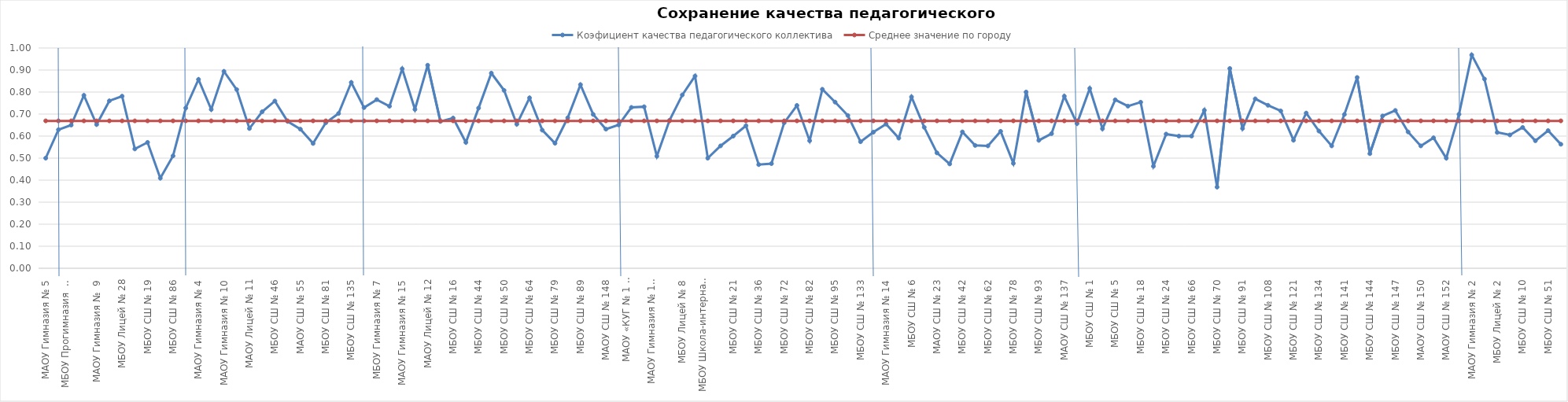
| Category | Коэфициент качества педагогического коллектива | Среднее значение по городу |
|---|---|---|
| МАОУ Гимназия № 5 | 0.5 | 0.669 |
| ЖЕЛЕЗНОДОРОЖНЫЙ РАЙОН | 0.629 | 0.669 |
| МБОУ Прогимназия  № 131 | 0.65 | 0.669 |
| МБОУ Гимназия № 8 | 0.785 | 0.669 |
| МАОУ Гимназия №  9 | 0.653 | 0.669 |
| МАОУ Лицей № 7 | 0.76 | 0.669 |
| МБОУ Лицей № 28 | 0.781 | 0.669 |
| МБОУ СШ  № 12 | 0.542 | 0.669 |
| МБОУ СШ № 19 | 0.571 | 0.669 |
| МАОУ СШ № 32 | 0.409 | 0.669 |
| МБОУ СШ № 86 | 0.51 | 0.669 |
| КИРОВСКИЙ РАЙОН | 0.728 | 0.669 |
| МАОУ Гимназия № 4 | 0.857 | 0.669 |
| МАОУ Гимназия № 6 | 0.721 | 0.669 |
| МАОУ Гимназия № 10 | 0.894 | 0.669 |
| МАОУ Лицей № 6 "Перспектива" | 0.811 | 0.669 |
| МАОУ Лицей № 11 | 0.635 | 0.669 |
| МБОУ СШ № 8 "Созидание" | 0.711 | 0.669 |
| МБОУ СШ № 46 | 0.759 | 0.669 |
| МБОУ СШ № 49 | 0.667 | 0.669 |
| МАОУ СШ № 55 | 0.632 | 0.669 |
| МБОУ СШ № 63 | 0.567 | 0.669 |
| МБОУ СШ № 81 | 0.661 | 0.669 |
| МБОУ СШ № 90 | 0.703 | 0.669 |
| МБОУ СШ № 135 | 0.844 | 0.669 |
| ЛЕНИНСКИЙ РАЙОН | 0.729 | 0.669 |
| МБОУ Гимназия № 7 | 0.766 | 0.669 |
| МАОУ Гимназия № 11 | 0.736 | 0.669 |
| МАОУ Гимназия № 15 | 0.905 | 0.669 |
| МБОУ Лицей № 3 | 0.721 | 0.669 |
| МАОУ Лицей № 12 | 0.922 | 0.669 |
| МБОУ СШ № 13 | 0.667 | 0.669 |
| МБОУ СШ № 16 | 0.682 | 0.669 |
| МБОУ СШ № 31 | 0.571 | 0.669 |
| МБОУ СШ № 44 | 0.727 | 0.669 |
| МБОУ СШ № 47 | 0.886 | 0.669 |
| МБОУ СШ № 50 | 0.808 | 0.669 |
| МБОУ СШ № 53 | 0.654 | 0.669 |
| МБОУ СШ № 64 | 0.774 | 0.669 |
| МБОУ СШ № 65 | 0.627 | 0.669 |
| МБОУ СШ № 79 | 0.568 | 0.669 |
| МБОУ СШ № 88 | 0.683 | 0.669 |
| МБОУ СШ № 89 | 0.833 | 0.669 |
| МБОУ СШ № 94 | 0.698 | 0.669 |
| МАОУ СШ № 148 | 0.632 | 0.669 |
| ОКТЯБРЬСКИЙ РАЙОН | 0.651 | 0.669 |
| МАОУ «КУГ № 1 – Универс» | 0.73 | 0.669 |
| МАОУ Гимназия № 3 | 0.733 | 0.669 |
| МАОУ Гимназия № 13 "Академ" | 0.509 | 0.669 |
| МАОУ Лицей № 1 | 0.672 | 0.669 |
| МБОУ Лицей № 8 | 0.787 | 0.669 |
| МБОУ Лицей № 10 | 0.873 | 0.669 |
| МБОУ Школа-интернат № 1 | 0.5 | 0.669 |
| МБОУ СШ № 3 | 0.556 | 0.669 |
| МБОУ СШ № 21 | 0.6 | 0.669 |
| МБОУ СШ № 30 | 0.647 | 0.669 |
| МБОУ СШ № 36 | 0.471 | 0.669 |
| МБОУ СШ № 39 | 0.475 | 0.669 |
| МБОУ СШ № 72 | 0.66 | 0.669 |
| МБОУ СШ № 73 | 0.739 | 0.669 |
| МБОУ СШ № 82 | 0.579 | 0.669 |
| МБОУ СШ № 84 | 0.812 | 0.669 |
| МБОУ СШ № 95 | 0.754 | 0.669 |
| МБОУ СШ № 99 | 0.694 | 0.669 |
| МБОУ СШ № 133 | 0.574 | 0.669 |
| СВЕРДЛОВСКИЙ РАЙОН | 0.618 | 0.669 |
| МАОУ Гимназия № 14 | 0.655 | 0.669 |
| МАОУ Лицей № 9 "Лидер" | 0.591 | 0.669 |
| МБОУ СШ № 6 | 0.778 | 0.669 |
| МБОУ СШ № 17 | 0.64 | 0.669 |
| МАОУ СШ № 23 | 0.524 | 0.669 |
| МБОУ СШ № 34 | 0.474 | 0.669 |
| МБОУ СШ № 42 | 0.619 | 0.669 |
| МБОУ СШ № 45 | 0.558 | 0.669 |
| МБОУ СШ № 62 | 0.556 | 0.669 |
| МБОУ СШ № 76 | 0.622 | 0.669 |
| МБОУ СШ № 78 | 0.476 | 0.669 |
| МБОУ СШ № 92 | 0.8 | 0.669 |
| МБОУ СШ № 93 | 0.581 | 0.669 |
| МБОУ СШ № 97 | 0.611 | 0.669 |
| МАОУ СШ № 137 | 0.781 | 0.669 |
| СОВЕТСКИЙ РАЙОН | 0.657 | 0.669 |
| МБОУ СШ № 1 | 0.816 | 0.669 |
| МБОУ СШ № 2 | 0.633 | 0.669 |
| МБОУ СШ № 5 | 0.765 | 0.669 |
| МБОУ СШ № 7 | 0.736 | 0.669 |
| МБОУ СШ № 18 | 0.754 | 0.669 |
| МАОУ СШ № 22 | 0.463 | 0.669 |
| МБОУ СШ № 24 | 0.609 | 0.669 |
| МБОУ СШ № 56 | 0.6 | 0.669 |
| МБОУ СШ № 66 | 0.6 | 0.669 |
| МБОУ СШ № 69 | 0.717 | 0.669 |
| МБОУ СШ № 70 | 0.368 | 0.669 |
| МБОУ СШ № 85 | 0.907 | 0.669 |
| МБОУ СШ № 91 | 0.635 | 0.669 |
| МБОУ СШ № 98 | 0.769 | 0.669 |
| МБОУ СШ № 108 | 0.74 | 0.669 |
| МБОУ СШ № 115 | 0.714 | 0.669 |
| МБОУ СШ № 121 | 0.581 | 0.669 |
| МБОУ СШ № 129 | 0.705 | 0.669 |
| МБОУ СШ № 134 | 0.623 | 0.669 |
| МБОУ СШ № 139 | 0.556 | 0.669 |
| МБОУ СШ № 141 | 0.698 | 0.669 |
| МАОУ СШ № 143 | 0.866 | 0.669 |
| МБОУ СШ № 144 | 0.52 | 0.669 |
| МАОУ СШ № 145 | 0.691 | 0.669 |
| МБОУ СШ № 147 | 0.716 | 0.669 |
| МАОУ СШ № 149 | 0.619 | 0.669 |
| МАОУ СШ № 150 | 0.556 | 0.669 |
| МАОУ СШ № 151 | 0.592 | 0.669 |
| МАОУ СШ № 152 | 0.5 | 0.669 |
| ЦЕНТРАЛЬНЫЙ РАЙОН | 0.699 | 0.669 |
| МАОУ Гимназия № 2 | 0.968 | 0.669 |
| МБОУ  Гимназия № 16 | 0.859 | 0.669 |
| МБОУ Лицей № 2 | 0.617 | 0.669 |
| МБОУ СШ № 4 | 0.605 | 0.669 |
| МБОУ СШ № 10 | 0.639 | 0.669 |
| МБОУ СШ № 27 | 0.579 | 0.669 |
| МБОУ СШ № 51 | 0.625 | 0.669 |
| МАОУ СШ № 153 | 0.563 | 0.669 |